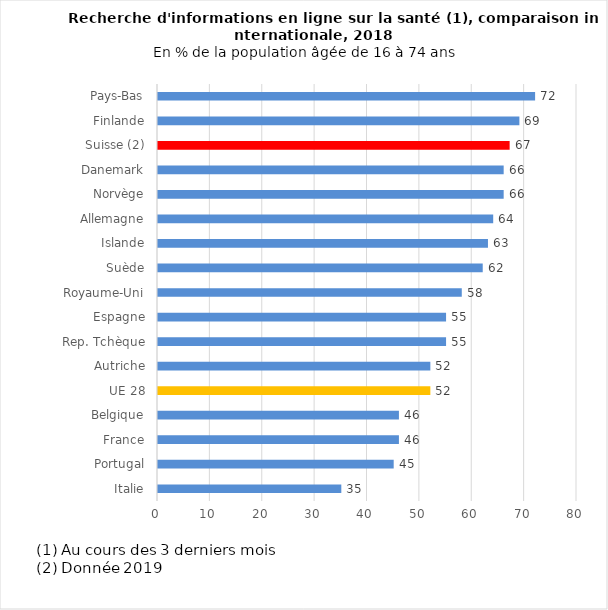
| Category | 2018 |
|---|---|
| Italie | 35 |
| Portugal | 45 |
| France | 46 |
| Belgique | 46 |
| UE 28 | 52 |
| Autriche | 52 |
| Rep. Tchèque | 55 |
| Espagne | 55 |
| Royaume-Uni | 58 |
| Suède | 62 |
| Islande | 63 |
| Allemagne | 64 |
| Norvège | 66 |
| Danemark | 66 |
| Suisse (2) | 67.138 |
| Finlande | 69 |
| Pays-Bas | 72 |